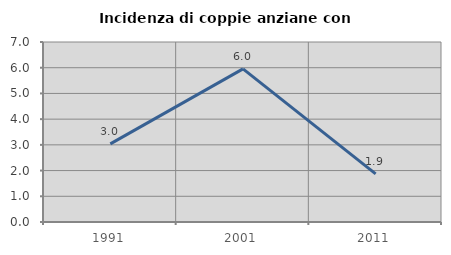
| Category | Incidenza di coppie anziane con figli |
|---|---|
| 1991.0 | 3.037 |
| 2001.0 | 5.955 |
| 2011.0 | 1.872 |